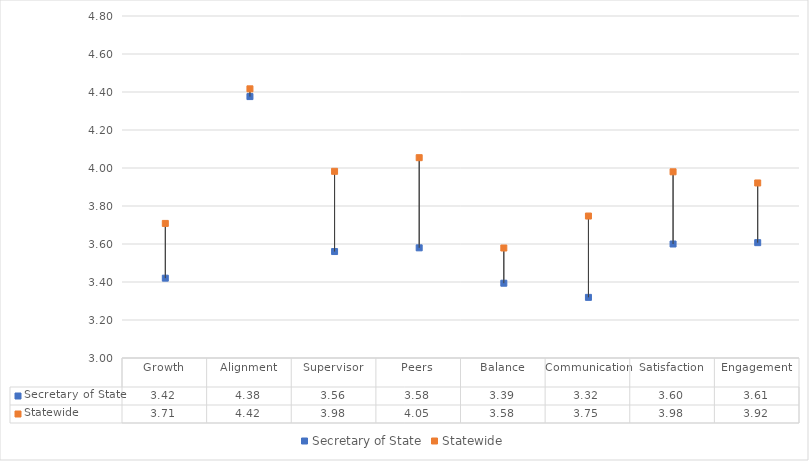
| Category | Secretary of State | Statewide |
|---|---|---|
| Growth | 3.42 | 3.708 |
| Alignment | 4.376 | 4.417 |
| Supervisor | 3.56 | 3.983 |
| Peers | 3.58 | 4.054 |
| Balance | 3.394 | 3.579 |
| Communication | 3.319 | 3.747 |
| Satisfaction | 3.6 | 3.98 |
| Engagement | 3.607 | 3.921 |